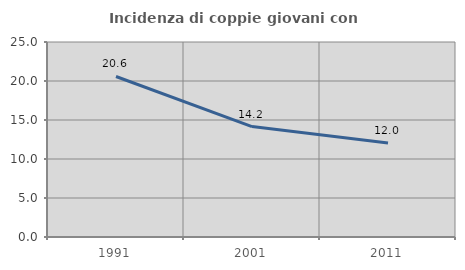
| Category | Incidenza di coppie giovani con figli |
|---|---|
| 1991.0 | 20.58 |
| 2001.0 | 14.162 |
| 2011.0 | 12.045 |